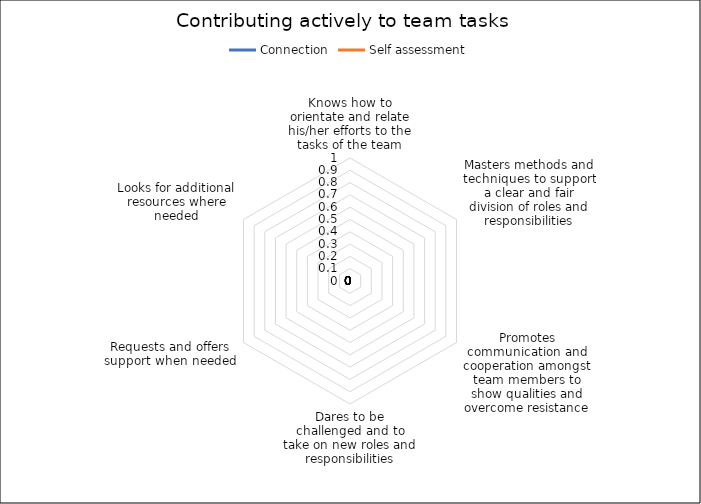
| Category | Connection | Self assessment |
|---|---|---|
| Knows how to orientate and relate his/her efforts to the tasks of the team | 0 | 0 |
| Masters methods and techniques to support a clear and fair division of roles and responsibilities | 0 | 0 |
| Promotes communication and cooperation amongst team members to show qualities and overcome resistance | 0 | 0 |
| Dares to be challenged and to take on new roles and responsibilities | 0 | 0 |
| Requests and offers support when needed | 0 | 0 |
| Looks for additional resources where needed | 0 | 0 |